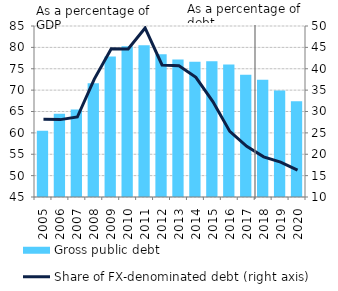
| Category | Gross public debt |
|---|---|
| 2005.0 | 60.478 |
| 2006.0 | 64.456 |
| 2007.0 | 65.472 |
| 2008.0 | 71.581 |
| 2009.0 | 77.841 |
| 2010.0 | 80.248 |
| 2011.0 | 80.482 |
| 2012.0 | 78.373 |
| 2013.0 | 77.148 |
| 2014.0 | 76.63 |
| 2015.0 | 76.729 |
| 2016.0 | 75.98 |
| 2017.0 | 73.581 |
| 2018.0 | 72.44 |
| 2019.0 | 69.899 |
| 2020.0 | 67.421 |